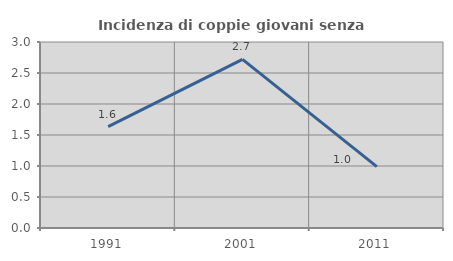
| Category | Incidenza di coppie giovani senza figli |
|---|---|
| 1991.0 | 1.634 |
| 2001.0 | 2.719 |
| 2011.0 | 0.99 |